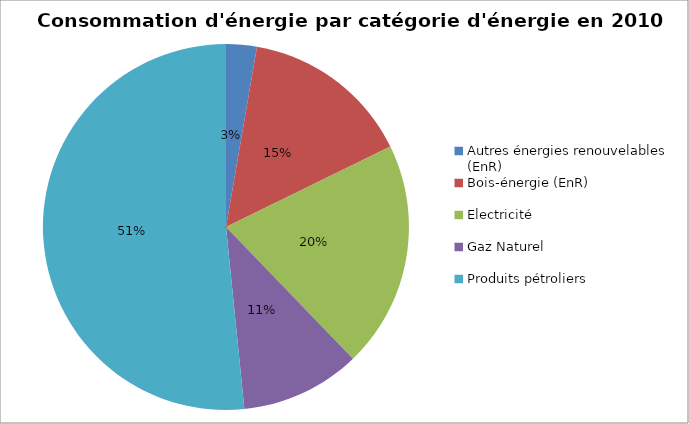
| Category | Series 0 |
|---|---|
| Autres énergies renouvelables (EnR) | 6311.414 |
| Bois-énergie (EnR) | 35066.537 |
| Electricité | 46713.755 |
| Gaz Naturel | 24718.209 |
| Produits pétroliers | 120266.153 |